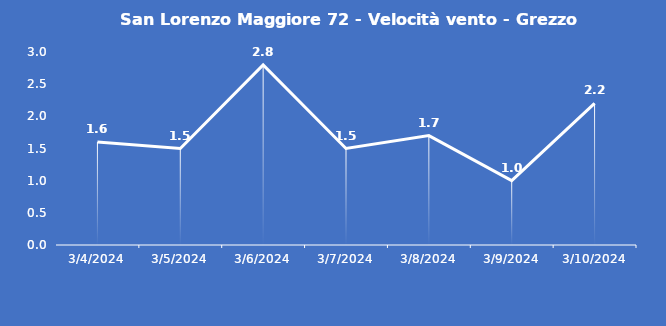
| Category | San Lorenzo Maggiore 72 - Velocità vento - Grezzo (m/s) |
|---|---|
| 3/4/24 | 1.6 |
| 3/5/24 | 1.5 |
| 3/6/24 | 2.8 |
| 3/7/24 | 1.5 |
| 3/8/24 | 1.7 |
| 3/9/24 | 1 |
| 3/10/24 | 2.2 |